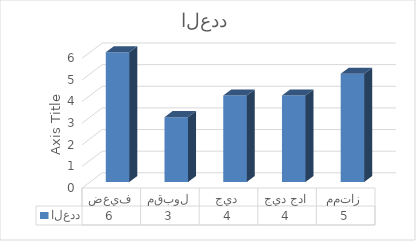
| Category | العدد |
|---|---|
| ممتاز | 5 |
| جيد جدا | 4 |
| جيد | 4 |
| مقبول | 3 |
| ضعيف | 6 |